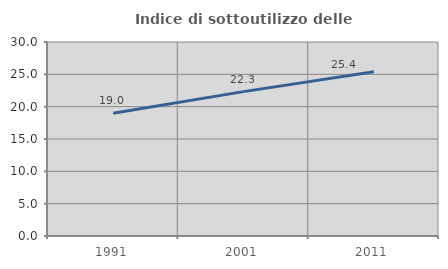
| Category | Indice di sottoutilizzo delle abitazioni  |
|---|---|
| 1991.0 | 18.977 |
| 2001.0 | 22.325 |
| 2011.0 | 25.389 |